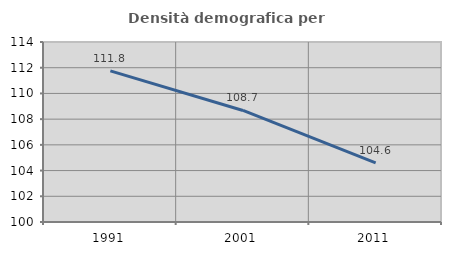
| Category | Densità demografica |
|---|---|
| 1991.0 | 111.754 |
| 2001.0 | 108.676 |
| 2011.0 | 104.592 |